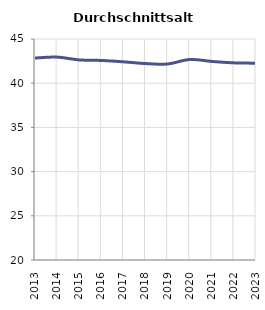
| Category | Durchschnittsalter |
|---|---|
| 2013.0 | 42.846 |
| 2014.0 | 42.951 |
| 2015.0 | 42.635 |
| 2016.0 | 42.574 |
| 2017.0 | 42.418 |
| 2018.0 | 42.223 |
| 2019.0 | 42.172 |
| 2020.0 | 42.68 |
| 2021.0 | 42.464 |
| 2022.0 | 42.3 |
| 2023.0 | 42.265 |